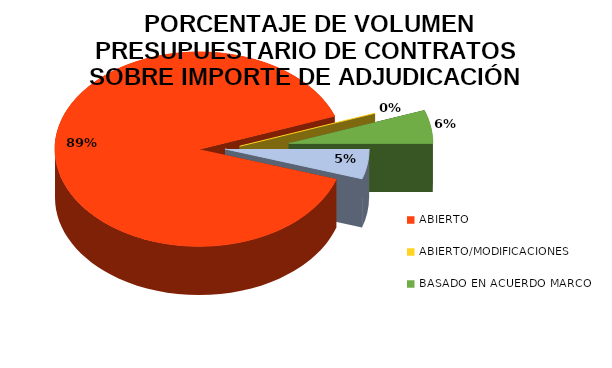
| Category |  PORCENTAJE DE VOLUMEN PRESUPUESTARIO DE CONTRATOS A TRAVÉS DE LOS PROCEDIMIENTOS DE ADJUDICACIÓN |
|---|---|
| MENOR | 0.05 |
| ABIERTO | 0.895 |
| ABIERTO/MODIFICACIONES | 0 |
| BASADO EN ACUERDO MARCO | 0.055 |